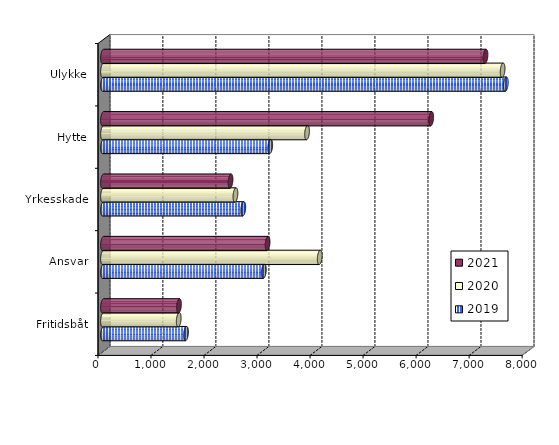
| Category | 2019 | 2020 | 2021 |
|---|---|---|---|
| Fritidsbåt | 1566.148 | 1428.298 | 1433.31 |
| Ansvar | 3033.528 | 4087.944 | 3104.315 |
| Yrkesskade | 2645.672 | 2497.857 | 2405.707 |
| Hytte | 3154.28 | 3848.886 | 6189.859 |
| Ulykke | 7597.193 | 7537.45 | 7214.344 |